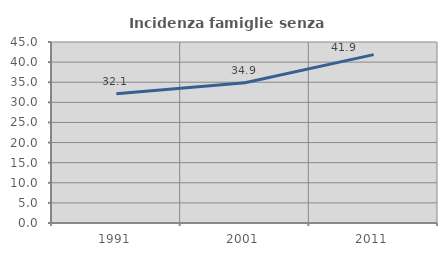
| Category | Incidenza famiglie senza nuclei |
|---|---|
| 1991.0 | 32.135 |
| 2001.0 | 34.851 |
| 2011.0 | 41.86 |